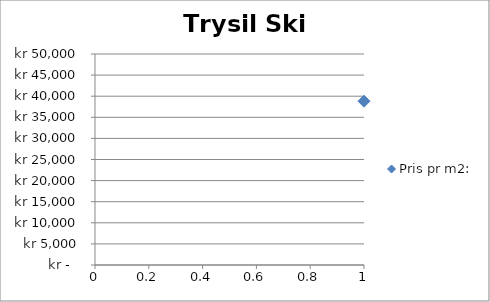
| Category | Pris pr m2: |
|---|---|
| 0 | 38814 |
| 1 | 24627 |
| 2 | 25600 |
| 3 | 25373 |
| 4 | 34324 |
| 5 | 29337 |
| 6 | 19759 |
| 7 | 37547 |
| 8 | 21053 |
| 9 | 39091 |
| 10 | 23196 |
| 11 | 37209 |
| 12 | 24528 |
| 13 | 29452 |
| 14 | 18321 |
| 15 | 20732 |
| 16 | 16883 |
| 17 | 20476 |
| 18 | 25167 |
| 19 | 25000 |
| 20 | 31646 |
| 21 | 30645 |
| 22 | 22388 |
| 23 | 27907 |
| 24 | 26190 |
| 25 | 25373 |
| 26 | 25373 |
| 27 | 22388 |
| 28 | 23295 |
| 29 | 25455 |
| 30 | 24074 |
| 31 | 22297 |
| 32 | 30750 |
| 33 | 27451 |
| 34 | 27011 |
| 35 | 24478 |
| 36 | 31475 |
| 37 | 35776 |
| 38 | 36638 |
| 39 | 23881 |
| 40 | 21875 |
| 41 | 25614 |
| 42 | 21184 |
| 43 | 36957 |
| 44 | 24328 |
| 45 | 40132 |
| 46 | 28214 |
| 47 | 23507 |
| 48 | 25625 |
| 49 | 15926 |
| 50 | 25167 |
| 51 | 24627 |
| 52 | 27137 |
| 53 | 22761 |
| 54 | 27193 |
| 55 | 26471 |
| 56 | 25933 |
| 57 | 22267 |
| 58 | 27703 |
| 59 | 26429 |
| 60 | 23134 |
| 61 | 35000 |
| 62 | 27257 |
| 63 | 27734 |
| 64 | 26685 |
| 65 | 24265 |
| 66 | 38571 |
| 67 | 32566 |
| 68 | 29464 |
| 69 | 25000 |
| 70 | 29688 |
| 71 | 28571 |
| 72 | 26000 |
| 73 | 22836 |
| 74 | 30645 |
| 75 | 22727 |
| 76 | 26071 |
| 77 | 23881 |
| 78 | 22667 |
| 79 | 36364 |
| 80 | 23582 |
| 81 | 30137 |
| 82 | 27703 |
| 83 | 26866 |
| 84 | 38158 |
| 85 | 30833 |
| 86 | 23333 |
| 87 | 26667 |
| 88 | 28716 |
| 89 | 38049 |
| 90 | 26866 |
| 91 | 22206 |
| 92 | 25373 |
| 93 | 23134 |
| 94 | 34762 |
| 95 | 22761 |
| 96 | 28481 |
| 97 | 24375 |
| 98 | 28125 |
| 99 | 25000 |
| 100 | 34483 |
| 101 | 25990 |
| 102 | 34615 |
| 103 | 31319 |
| 104 | 26582 |
| 105 | 34421 |
| 106 | 21364 |
| 107 | 26042 |
| 108 | 30051 |
| 109 | 24747 |
| 110 | 25904 |
| 111 | 22222 |
| 112 | 26415 |
| 113 | 25904 |
| 114 | 36667 |
| 115 | 24403 |
| 116 | 25455 |
| 117 | 23731 |
| 118 | 35833 |
| 119 | 30405 |
| 120 | 31520 |
| 121 | 36638 |
| 122 | 18774 |
| 123 | 34000 |
| 124 | 31858 |
| 125 | 37209 |
| 126 | 30682 |
| 127 | 37188 |
| 128 | 33333 |
| 129 | 22000 |
| 130 | 28704 |
| 131 | 24339 |
| 132 | 24254 |
| 133 | 25223 |
| 134 | 28797 |
| 135 | 28909 |
| 136 | 27308 |
| 137 | 25455 |
| 138 | 31667 |
| 139 | 26761 |
| 140 | 24937 |
| 141 | 23897 |
| 142 | 29310 |
| 143 | 22015 |
| 144 | 30571 |
| 145 | 29787 |
| 146 | 26220 |
| 147 | 25658 |
| 148 | 23827 |
| 149 | 30682 |
| 150 | 29787 |
| 151 | 33735 |
| 152 | 27652 |
| 153 | 19824 |
| 154 | 26176 |
| 155 | 32979 |
| 156 | 32292 |
| 157 | 25075 |
| 158 | 27686 |
| 159 | 29310 |
| 160 | 24638 |
| 161 | 31045 |
| 162 | 26639 |
| 163 | 27823 |
| 164 | 33544 |
| 165 | 29167 |
| 166 | 39634 |
| 167 | 37500 |
| 168 | 28636 |
| 169 | 27000 |
| 170 | 26970 |
| 171 | 32911 |
| 172 | 30000 |
| 173 | 29070 |
| 174 | 28750 |
| 175 | 34688 |
| 176 | 26866 |
| 177 | 23134 |
| 178 | 38235 |
| 179 | 34028 |
| 180 | 41875 |
| 181 | 26220 |
| 182 | 25410 |
| 183 | 31389 |
| 184 | 25625 |
| 185 | 18750 |
| 186 | 44800 |
| 187 | 31250 |
| 188 | 43407 |
| 189 | 30120 |
| 190 | 26563 |
| 191 | 25373 |
| 192 | 26613 |
| 193 | 30392 |
| 194 | 27400 |
| 195 | 25000 |
| 196 | 29798 |
| 197 | 26324 |
| 198 | 29720 |
| 199 | 38136 |
| 200 | 41104 |
| 201 | 27982 |
| 202 | 21661 |
| 203 | 25938 |
| 204 | 30189 |
| 205 | 23786 |
| 206 | 25758 |
| 207 | 36364 |
| 208 | 28986 |
| 209 | 29615 |
| 210 | 24632 |